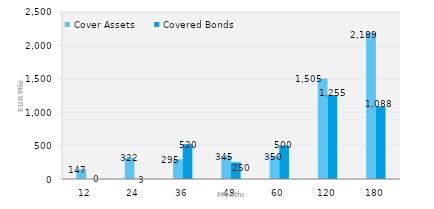
| Category | Cover Assets | Covered Bonds |
|---|---|---|
| 12.0 | 147 | 0 |
| 24.0 | 322 | 3 |
| 36.0 | 295 | 520 |
| 48.0 | 345 | 250 |
| 60.0 | 350 | 500 |
| 120.0 | 1505 | 1255 |
| 180.0 | 2189 | 1088 |